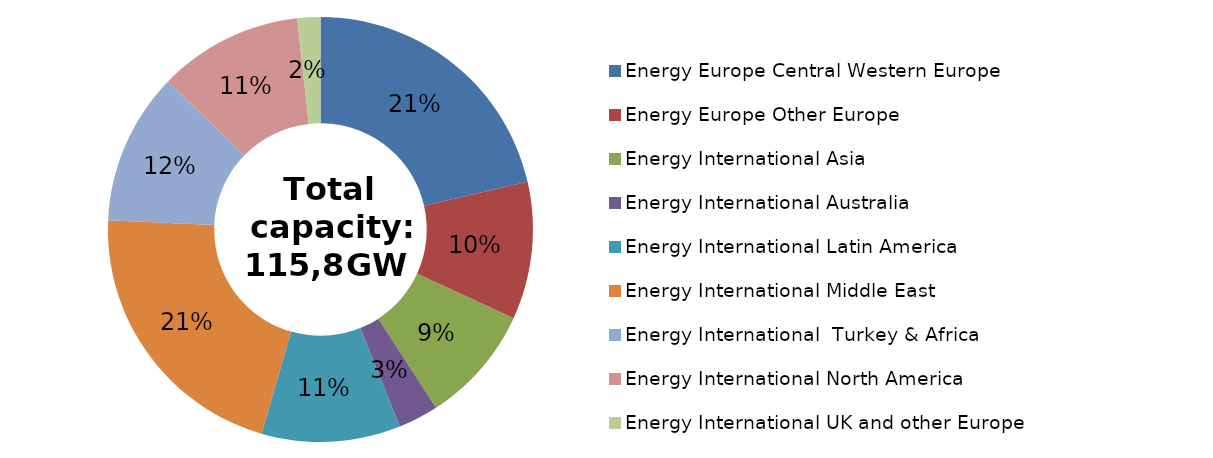
| Category | Total |
|---|---|
| 0 | 24763.73 |
| 1 | 12107.227 |
| 2 | 10413.05 |
| 3 | 3539.975 |
| 4 | 12221.257 |
| 5 | 24559.776 |
| 6 | 13405.724 |
| 7 | 12711.79 |
| 8 | 2028.491 |